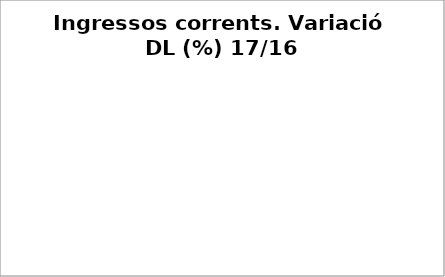
| Category | Series 0 |
|---|---|
| Impostos locals | 0.02 |
| Participació Tributs de l'Estat | -0.013 |
| Taxes i altres ingressos | -0.062 |
| Transferències corrents (exc. FCF) | 0.305 |
| Ingressos patrimonials | -0.27 |
| Ingressos corrents | 0 |